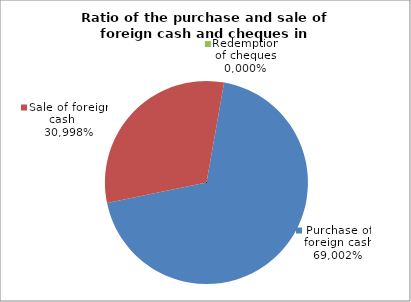
| Category | Purchase of foreign cash |
|---|---|
| 0 | 0.69 |
| 1 | 0.31 |
| 2 | 0 |